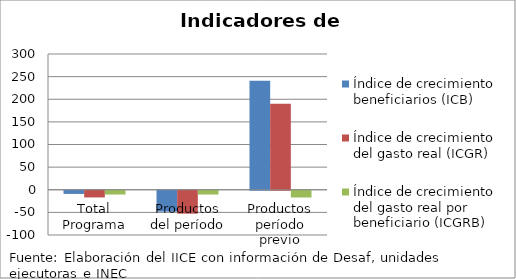
| Category | Índice de crecimiento beneficiarios (ICB)  | Índice de crecimiento del gasto real (ICGR)  | Índice de crecimiento del gasto real por beneficiario (ICGRB)  |
|---|---|---|---|
| Total Programa | -6.997 | -14.775 | -8.363 |
| Productos del período | -46.154 | -50.661 | -8.371 |
| Productos período previo | 240.909 | 190.025 | -14.926 |